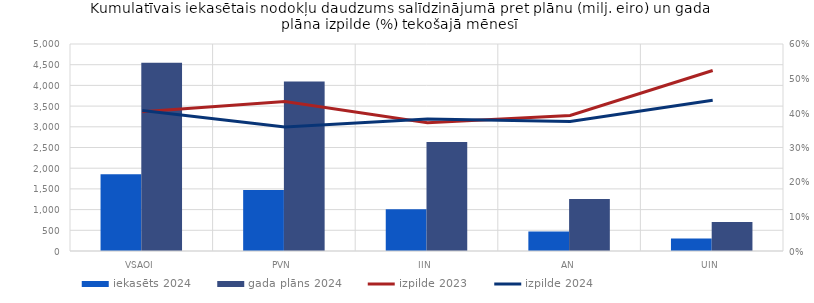
| Category | iekasēts 2024 | gada plāns 2024 |
|---|---|---|
| VSAOI | 1852.334 | 4544.733 |
| PVN | 1471.162 | 4096.678 |
| IIN | 1008.103 | 2634.714 |
| AN | 471.03 | 1254.984 |
| UIN | 304.892 | 697.842 |